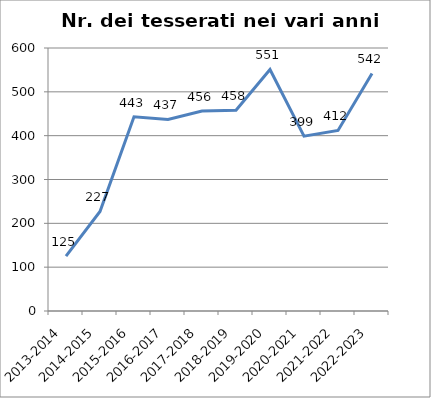
| Category | Nr. Tesserati |
|---|---|
| 2013-2014 | 125 |
| 2014-2015 | 227 |
| 2015-2016 | 443 |
| 2016-2017 | 437 |
| 2017-2018 | 456 |
| 2018-2019 | 458 |
| 2019-2020 | 551 |
| 2020-2021 | 399 |
| 2021-2022 | 412 |
| 2022-2023 | 542 |